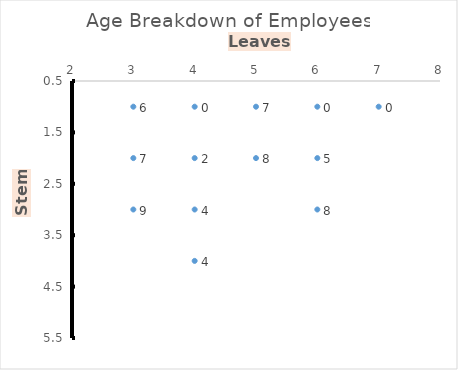
| Category | Series 0 |
|---|---|
| 3.0 | 1 |
| 3.0 | 2 |
| 3.0 | 3 |
| 4.0 | 1 |
| 4.0 | 2 |
| 4.0 | 3 |
| 4.0 | 4 |
| 5.0 | 1 |
| 5.0 | 2 |
| 6.0 | 1 |
| 6.0 | 2 |
| 6.0 | 3 |
| 7.0 | 1 |